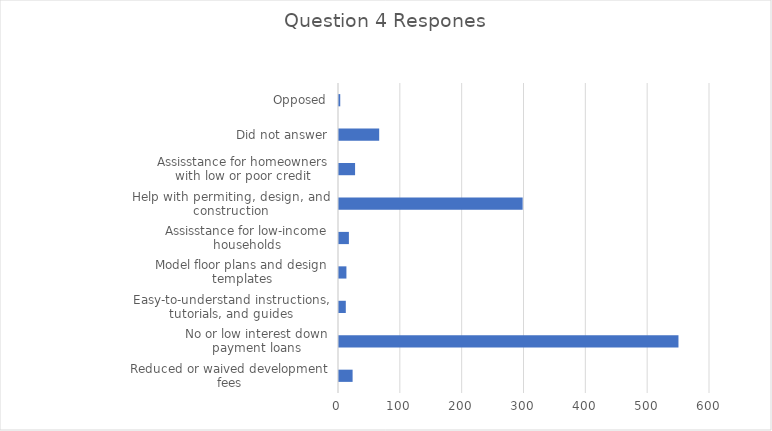
| Category | Series 0 |
|---|---|
| Reduced or waived development fees | 22 |
| No or low interest down payment loans | 549 |
| Easy-to-understand instructions, tutorials, and guides | 11 |
| Model floor plans and design templates | 12 |
| Assisstance for low-income households | 16 |
| Help with permiting, design, and construction | 297 |
| Assisstance for homeowners with low or poor credit | 26 |
| Did not answer | 65 |
| Opposed | 2 |